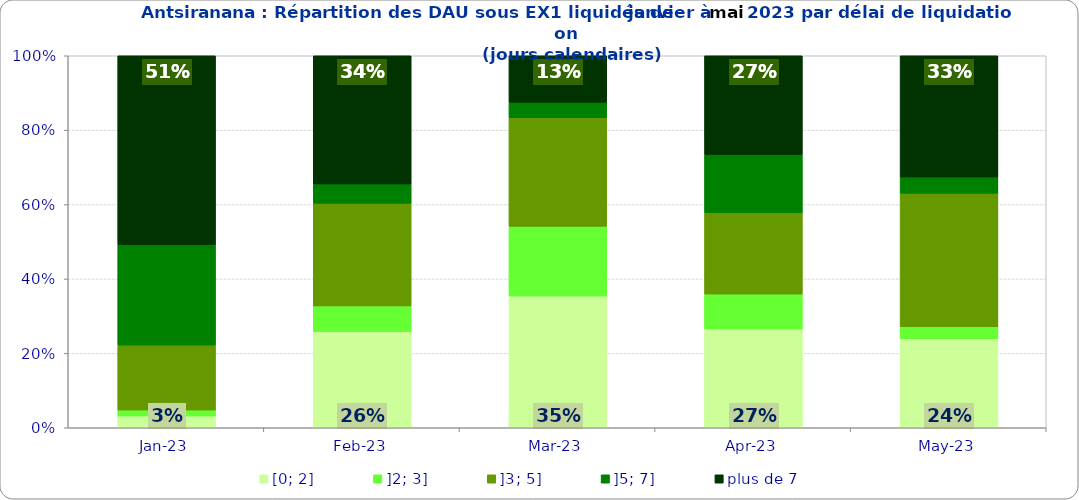
| Category | [0; 2] | ]2; 3] | ]3; 5] | ]5; 7] | plus de 7 |
|---|---|---|---|---|---|
| 2023-01-01 | 0.032 | 0.016 | 0.175 | 0.27 | 0.508 |
| 2023-02-01 | 0.259 | 0.069 | 0.276 | 0.052 | 0.345 |
| 2023-03-01 | 0.354 | 0.188 | 0.292 | 0.042 | 0.125 |
| 2023-04-01 | 0.266 | 0.094 | 0.219 | 0.156 | 0.266 |
| 2023-05-01 | 0.239 | 0.033 | 0.359 | 0.043 | 0.326 |